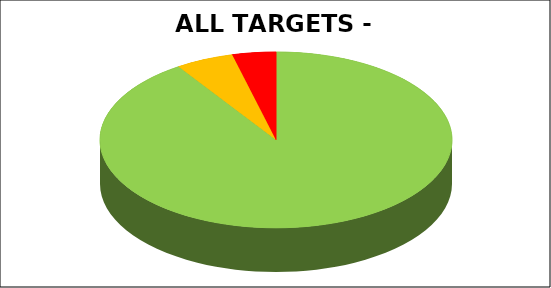
| Category | Series 0 |
|---|---|
| Green | 0.907 |
| Amber | 0.053 |
| Red | 0.04 |